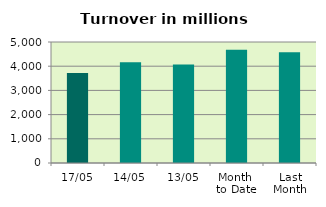
| Category | Series 0 |
|---|---|
| 17/05 | 3716.064 |
| 14/05 | 4158.711 |
| 13/05 | 4066.003 |
| Month 
to Date | 4682.13 |
| Last
Month | 4573.802 |